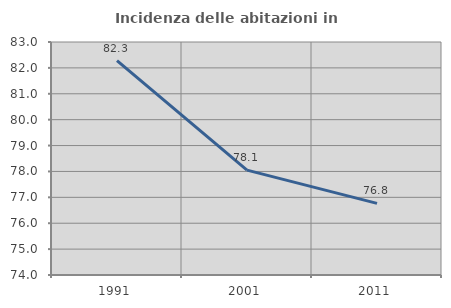
| Category | Incidenza delle abitazioni in proprietà  |
|---|---|
| 1991.0 | 82.281 |
| 2001.0 | 78.052 |
| 2011.0 | 76.766 |